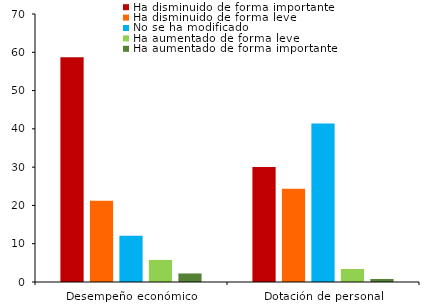
| Category | Ha disminuido de forma importante | Ha disminuido de forma leve | No se ha modificado | Ha aumentado de forma leve | Ha aumentado de forma importante |
|---|---|---|---|---|---|
| Desempeño económico | 58.716 | 21.232 | 12.058 | 5.767 | 2.228 |
| Dotación de personal | 30.013 | 24.377 | 41.415 | 3.408 | 0.786 |